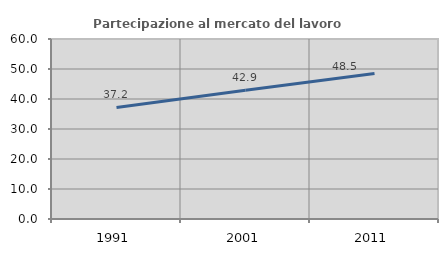
| Category | Partecipazione al mercato del lavoro  femminile |
|---|---|
| 1991.0 | 37.184 |
| 2001.0 | 42.928 |
| 2011.0 | 48.521 |